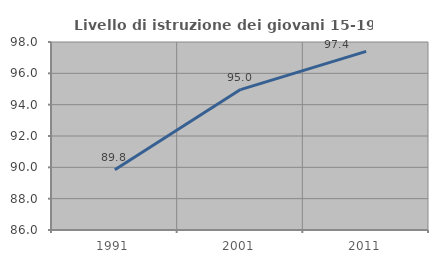
| Category | Livello di istruzione dei giovani 15-19 anni |
|---|---|
| 1991.0 | 89.84 |
| 2001.0 | 94.964 |
| 2011.0 | 97.403 |